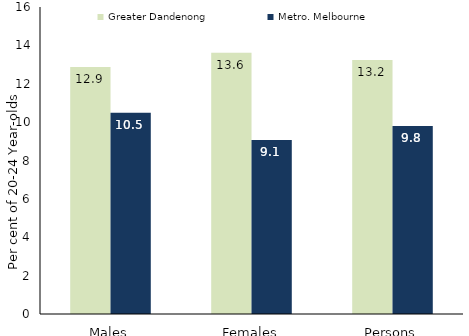
| Category | Greater Dandenong | Metro. Melbourne |
|---|---|---|
| Males | 12.874 | 10.482 |
| Females | 13.621 | 9.067 |
| Persons | 13.233 | 9.794 |